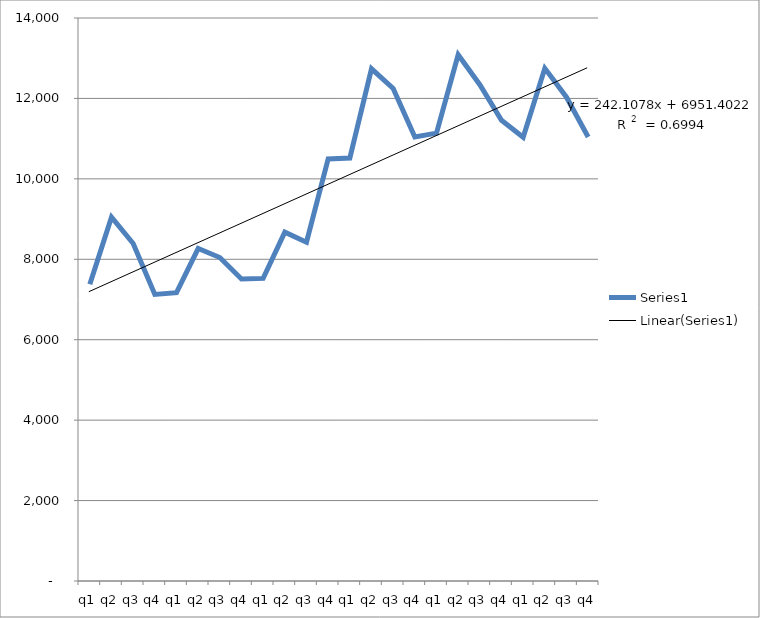
| Category | Series 0 |
|---|---|
| q1 | 7379 |
| q2 | 9046 |
| q3 | 8393 |
| q4 | 7126 |
| q1 | 7169 |
| q2 | 8267 |
| q3 | 8044 |
| q4 | 7510 |
| q1 | 7525 |
| q2 | 8674 |
| q3 | 8426 |
| q4 | 10494 |
| q1 | 10517 |
| q2 | 12737 |
| q3 | 12248 |
| q4 | 11040 |
| q1 | 11137 |
| q2 | 13085 |
| q3 | 12340 |
| q4 | 11455 |
| q1 | 11035 |
| q2 | 12749 |
| q3 | 12030 |
| q4 | 11040 |